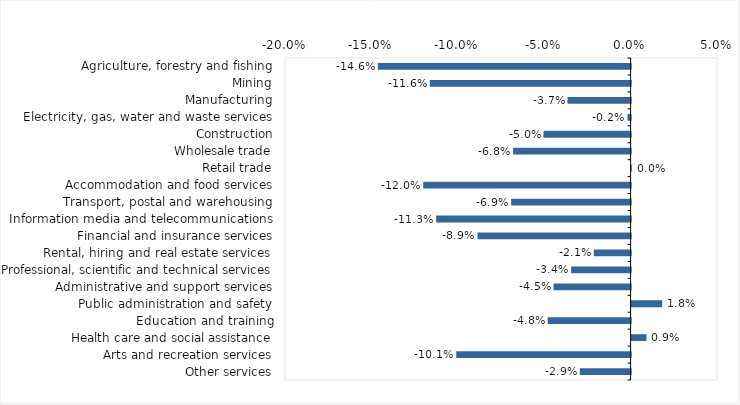
| Category | This week |
|---|---|
| Agriculture, forestry and fishing | -0.146 |
| Mining | -0.116 |
| Manufacturing | -0.036 |
| Electricity, gas, water and waste services | -0.002 |
| Construction | -0.05 |
| Wholesale trade | -0.068 |
| Retail trade | 0 |
| Accommodation and food services | -0.12 |
| Transport, postal and warehousing | -0.069 |
| Information media and telecommunications | -0.112 |
| Financial and insurance services | -0.089 |
| Rental, hiring and real estate services | -0.021 |
| Professional, scientific and technical services | -0.034 |
| Administrative and support services | -0.045 |
| Public administration and safety | 0.018 |
| Education and training | -0.048 |
| Health care and social assistance | 0.009 |
| Arts and recreation services | -0.101 |
| Other services | -0.029 |